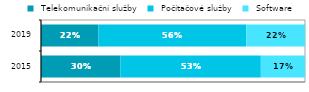
| Category |  Telekomunikační služby |  Počítačové služby |  Software |
|---|---|---|---|
| 2015.0 | 0.301 | 0.531 | 0.167 |
| 2019.0 | 0.217 | 0.56 | 0.222 |